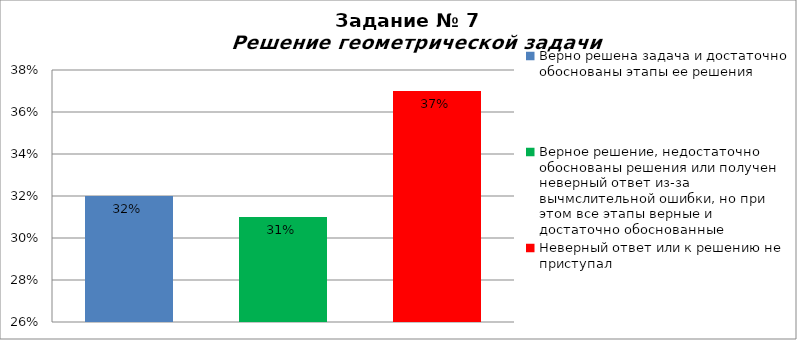
| Category | Решение геометрической задачи  |
|---|---|
| Верно решена задача и достаточно обоснованы этапы ее решения | 0.32 |
| Верное решение, недостаточно обоснованы решения или получен неверный ответ из-за вычмслительной ошибки, но при этом все этапы верные и достаточно обоснованные | 0.31 |
| Неверный ответ или к решению не приступал | 0.37 |